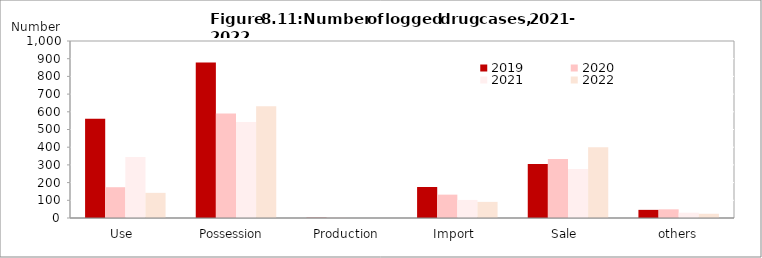
| Category | 2019  | 2020  | 2021  | 2022 |
|---|---|---|---|---|
| Use  | 561 | 174 | 344 | 142 |
| Possession  | 878 | 590 | 543 | 632 |
| Production | 1 | 1 | 0 | 0 |
| Import  | 175 | 132 | 102 | 91 |
| Sale  | 305 | 334 | 277 | 400 |
| others | 46 | 49 | 30 | 24 |